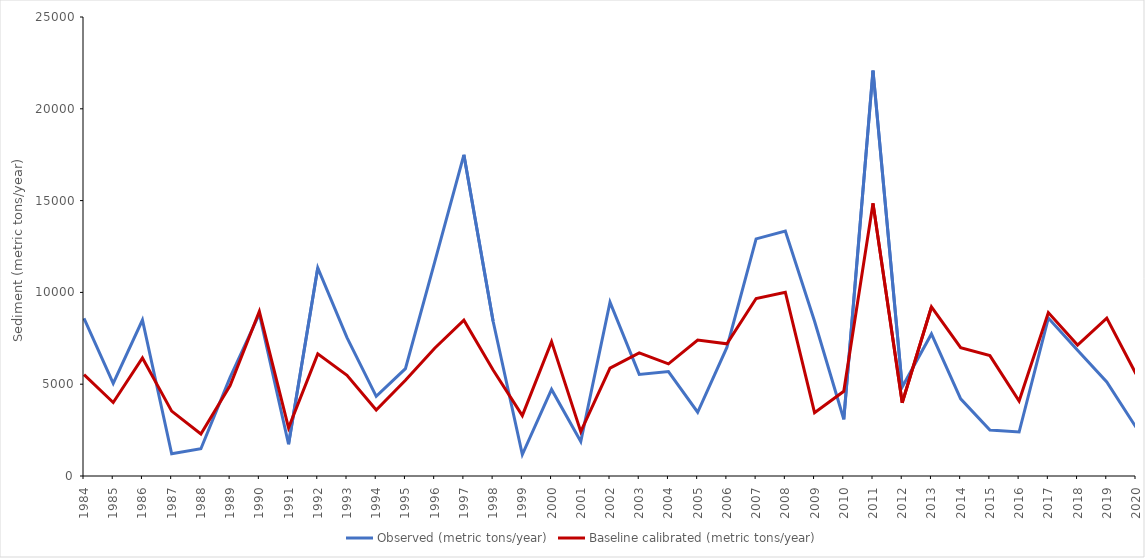
| Category | Observed (metric tons/year) | Baseline calibrated (metric tons/year) |
|---|---|---|
| 1984.0 | 8587.151 | 5522 |
| 1985.0 | 5042.122 | 4003 |
| 1986.0 | 8496.605 | 6432 |
| 1987.0 | 1207.753 | 3534 |
| 1988.0 | 1485.516 | 2285 |
| 1989.0 | 5374.004 | 4927 |
| 1990.0 | 8832.062 | 8967 |
| 1991.0 | 1728.951 | 2620 |
| 1992.0 | 11337.403 | 6653 |
| 1993.0 | 7534.808 | 5482 |
| 1994.0 | 4338.37 | 3592 |
| 1995.0 | 5844.211 | 5212 |
| 1996.0 | 11644.666 | 6957 |
| 1997.0 | 17495.489 | 8483 |
| 1998.0 | 8424.631 | 5772 |
| 1999.0 | 1166.16 | 3288 |
| 2000.0 | 4716.793 | 7317 |
| 2001.0 | 1879.708 | 2413 |
| 2002.0 | 9463.908 | 5876 |
| 2003.0 | 5533.008 | 6705 |
| 2004.0 | 5690.864 | 6105 |
| 2005.0 | 3472.5 | 7403 |
| 2006.0 | 7003.975 | 7200 |
| 2007.0 | 12915.477 | 9666 |
| 2008.0 | 13336.885 | 10010 |
| 2009.0 | 8430.574 | 3451 |
| 2010.0 | 3090.113 | 4614 |
| 2011.0 | 22081.273 | 14850 |
| 2012.0 | 4852.762 | 3990 |
| 2013.0 | 7737.409 | 9207 |
| 2014.0 | 4204.82 | 6987 |
| 2015.0 | 2509.158 | 6554 |
| 2016.0 | 2394.858 | 4081 |
| 2017.0 | 8604.672 | 8902 |
| 2018.0 | 6849.913 | 7135 |
| 2019.0 | 5124.803 | 8598 |
| 2020.0 | 2657.45 | 5559 |